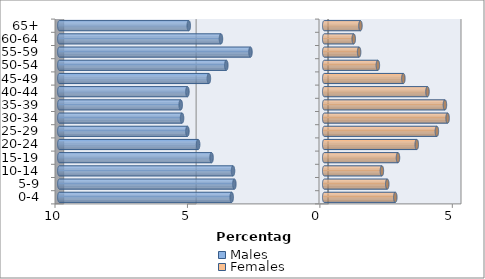
| Category | Males | Females |
|---|---|---|
| 0-4 | -3.494 | 2.684 |
| 5-9 | -3.392 | 2.38 |
| 10-14 | -3.443 | 2.177 |
| 15-19 | -4.253 | 2.785 |
| 20-24 | -4.759 | 3.494 |
| 25-29 | -5.165 | 4.253 |
| 30-34 | -5.367 | 4.658 |
| 35-39 | -5.418 | 4.557 |
| 40-44 | -5.165 | 3.899 |
| 45-49 | -4.354 | 2.987 |
| 50-54 | -3.696 | 2.025 |
| 55-59 | -2.785 | 1.316 |
| 60-64 | -3.899 | 1.114 |
| 65+ | -5.114 | 1.367 |